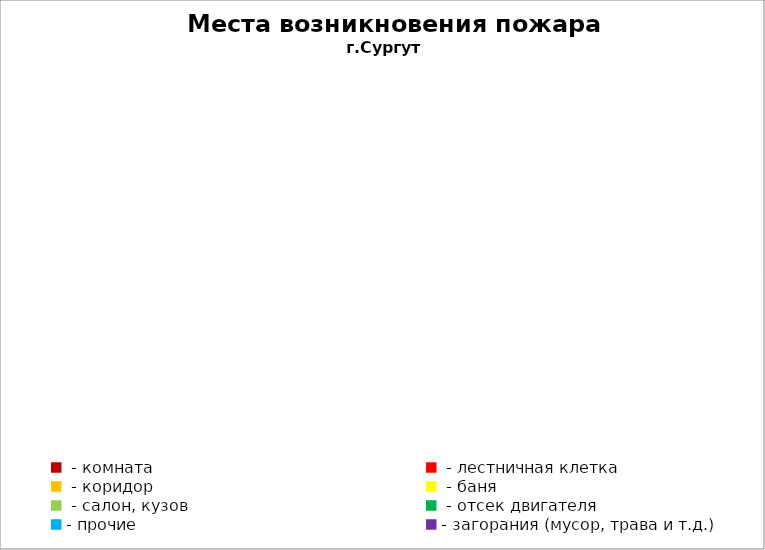
| Category | Места возникновения пожара |
|---|---|
|  - комната | 43 |
|  - лестничная клетка | 11 |
|  - коридор | 6 |
|  - баня | 13 |
|  - салон, кузов | 5 |
|  - отсек двигателя | 10 |
| - прочие | 55 |
| - загорания (мусор, трава и т.д.)  | 101 |